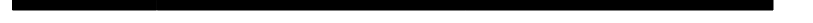
| Category | Series 0 | Series 1 |
|---|---|---|
| 0 | 19.015 | 80.985 |